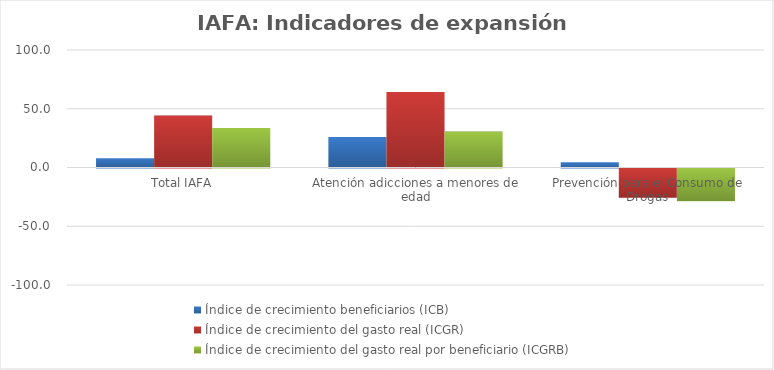
| Category | Índice de crecimiento beneficiarios (ICB)  | Índice de crecimiento del gasto real (ICGR)  | Índice de crecimiento del gasto real por beneficiario (ICGRB)  |
|---|---|---|---|
| Total IAFA | 7.973 | 44.205 | 33.556 |
| Atención adicciones a menores de edad | 25.894 | 64.34 | 30.538 |
| Prevención para el Consumo de Drogas | 4.371 | -24.821 | -27.969 |